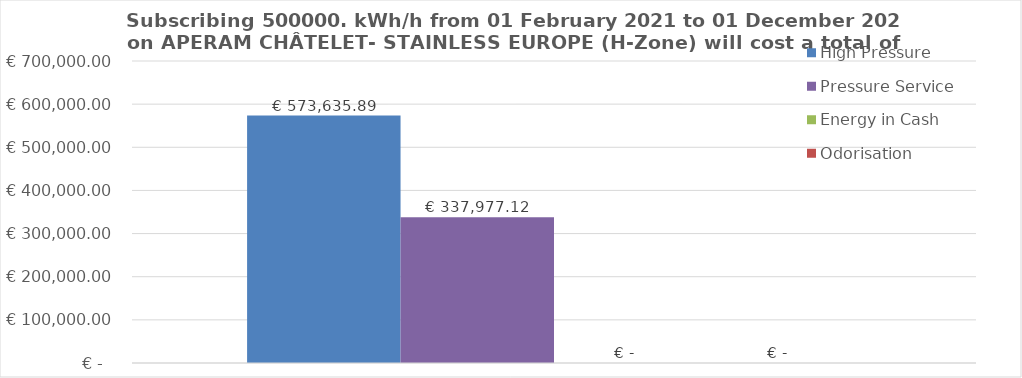
| Category | High Pressure | Pressure Service | Energy in Cash  | Odorisation |
|---|---|---|---|---|
|  | 573635.89 | 337977.123 | 0 | 0 |